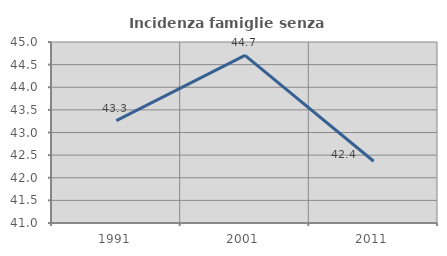
| Category | Incidenza famiglie senza nuclei |
|---|---|
| 1991.0 | 43.262 |
| 2001.0 | 44.706 |
| 2011.0 | 42.365 |